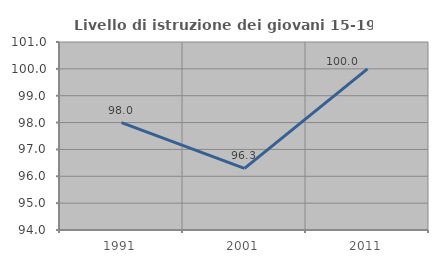
| Category | Livello di istruzione dei giovani 15-19 anni |
|---|---|
| 1991.0 | 98 |
| 2001.0 | 96.296 |
| 2011.0 | 100 |